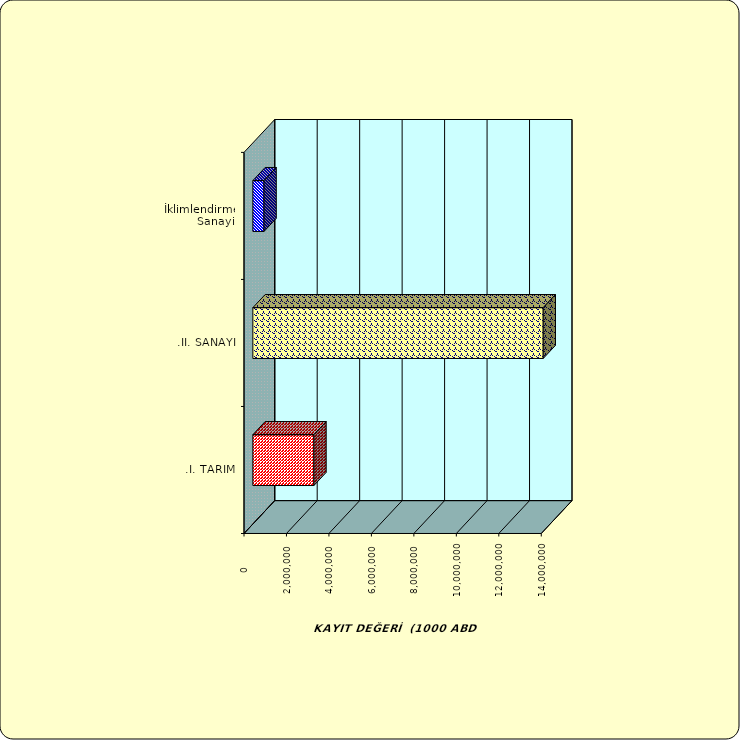
| Category | Series 0 |
|---|---|
| .I. TARIM | 2875570.648 |
| .II. SANAYİ | 13674372.704 |
|  İklimlendirme Sanayii | 525475.298 |